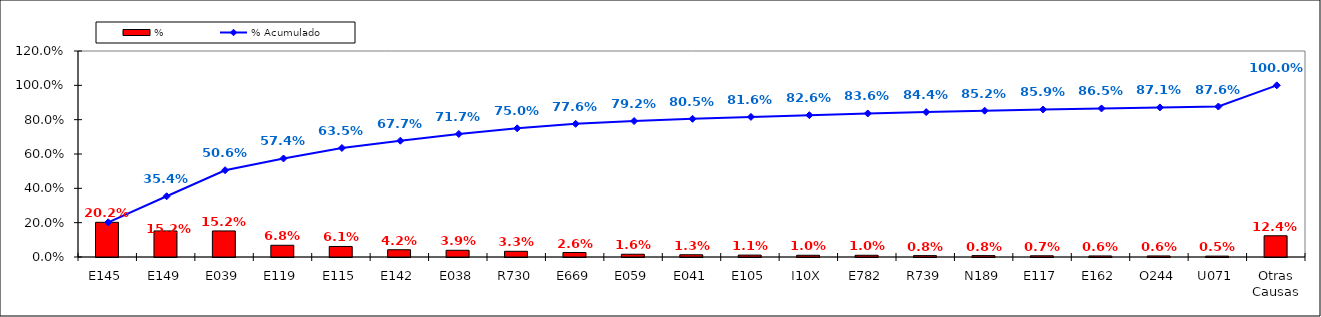
| Category | % |
|---|---|
| E145 | 0.202 |
| E149 | 0.152 |
| E039 | 0.152 |
| E119 | 0.068 |
| E115 | 0.061 |
| E142 | 0.042 |
| E038 | 0.039 |
| R730 | 0.033 |
| E669 | 0.026 |
| E059 | 0.016 |
| E041 | 0.013 |
| E105 | 0.011 |
| I10X | 0.01 |
| E782 | 0.01 |
| R739 | 0.008 |
| N189 | 0.008 |
| E117 | 0.007 |
| E162 | 0.006 |
| O244 | 0.006 |
| U071 | 0.005 |
| Otras Causas | 0.124 |